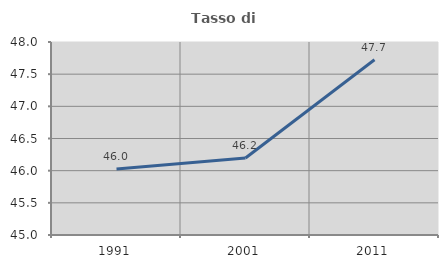
| Category | Tasso di occupazione   |
|---|---|
| 1991.0 | 46.025 |
| 2001.0 | 46.197 |
| 2011.0 | 47.723 |